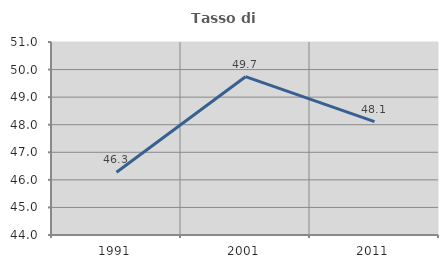
| Category | Tasso di occupazione   |
|---|---|
| 1991.0 | 46.277 |
| 2001.0 | 49.742 |
| 2011.0 | 48.109 |